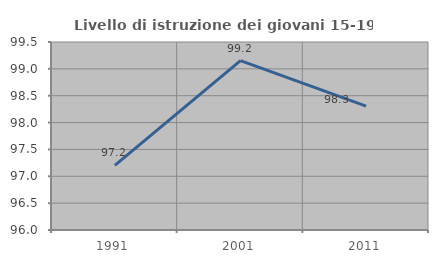
| Category | Livello di istruzione dei giovani 15-19 anni |
|---|---|
| 1991.0 | 97.203 |
| 2001.0 | 99.153 |
| 2011.0 | 98.305 |